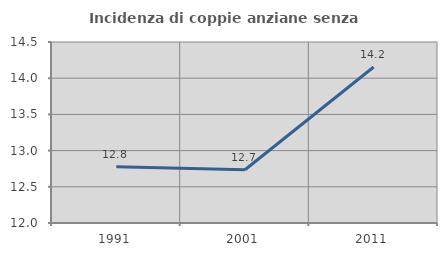
| Category | Incidenza di coppie anziane senza figli  |
|---|---|
| 1991.0 | 12.778 |
| 2001.0 | 12.736 |
| 2011.0 | 14.155 |